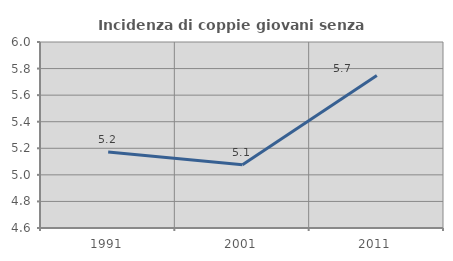
| Category | Incidenza di coppie giovani senza figli |
|---|---|
| 1991.0 | 5.172 |
| 2001.0 | 5.075 |
| 2011.0 | 5.747 |